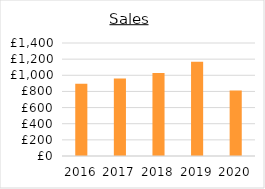
| Category | Series 0 |
|---|---|
| 2016.0 | 894 |
| 2017.0 | 960 |
| 2018.0 | 1029 |
| 2019.0 | 1168 |
| 2020.0 | 811 |